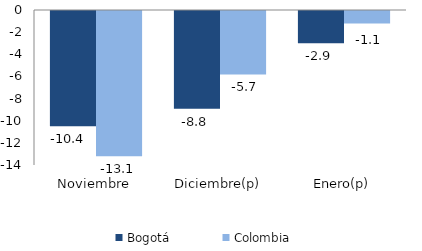
| Category | Bogotá | Colombia |
|---|---|---|
| Noviembre | -10.413 | -13.122 |
| Diciembre(p) | -8.823 | -5.73 |
| Enero(p) | -2.916 | -1.138 |